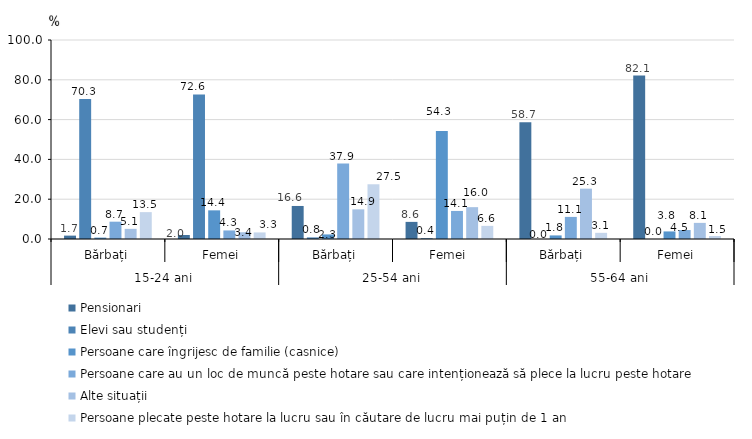
| Category | Pensionari | Elevi sau studenți | Persoane care îngrijesc de familie (casnice) | Persoane care au un loc de muncă peste hotare sau care intenționează să plece la lucru peste hotare | Alte situații | Persoane plecate peste hotare la lucru sau în căutare de lucru mai puțin de 1 an |
|---|---|---|---|---|---|---|
| 0 | 1.7 | 70.3 | 0.7 | 8.7 | 5.1 | 13.5 |
| 1 | 2 | 72.6 | 14.4 | 4.3 | 3.4 | 3.3 |
| 2 | 16.6 | 0.8 | 2.3 | 37.9 | 14.9 | 27.5 |
| 3 | 8.6 | 0.4 | 54.3 | 14.1 | 16 | 6.6 |
| 4 | 58.7 | 0 | 1.8 | 11.1 | 25.3 | 3.1 |
| 5 | 82.1 | 0 | 3.8 | 4.5 | 8.1 | 1.5 |